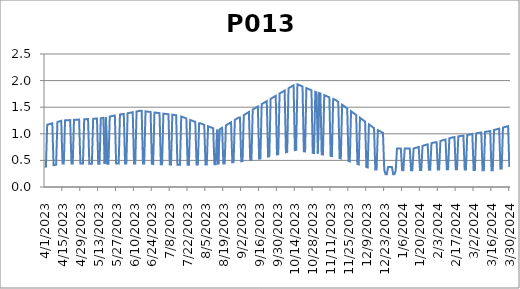
| Category | P013 |
|---|---|
| 4/1/23 | 0.38 |
| 4/2/23 | 0.384 |
| 4/3/23 | 1.17 |
| 4/4/23 | 1.177 |
| 4/5/23 | 1.184 |
| 4/6/23 | 1.19 |
| 4/7/23 | 1.197 |
| 4/8/23 | 0.411 |
| 4/9/23 | 0.415 |
| 4/10/23 | 0.42 |
| 4/11/23 | 1.223 |
| 4/12/23 | 1.23 |
| 4/13/23 | 1.236 |
| 4/14/23 | 1.243 |
| 4/15/23 | 0.442 |
| 4/16/23 | 0.442 |
| 4/17/23 | 1.252 |
| 4/18/23 | 1.254 |
| 4/19/23 | 1.255 |
| 4/20/23 | 1.257 |
| 4/21/23 | 1.258 |
| 4/22/23 | 0.441 |
| 4/23/23 | 0.441 |
| 4/24/23 | 1.262 |
| 4/25/23 | 1.264 |
| 4/26/23 | 1.265 |
| 4/27/23 | 1.266 |
| 4/28/23 | 1.268 |
| 4/29/23 | 0.44 |
| 4/30/23 | 0.44 |
| 5/1/23 | 0.439 |
| 5/2/23 | 1.273 |
| 5/3/23 | 1.275 |
| 5/4/23 | 1.276 |
| 5/5/23 | 1.277 |
| 5/6/23 | 0.439 |
| 5/7/23 | 0.439 |
| 5/8/23 | 0.438 |
| 5/9/23 | 1.283 |
| 5/10/23 | 1.284 |
| 5/11/23 | 1.286 |
| 5/12/23 | 1.287 |
| 5/13/23 | 0.438 |
| 5/14/23 | 0.437 |
| 5/15/23 | 1.291 |
| 5/16/23 | 1.296 |
| 5/17/23 | 1.301 |
| 5/18/23 | 0.438 |
| 5/19/23 | 1.31 |
| 5/20/23 | 0.438 |
| 5/21/23 | 0.438 |
| 5/22/23 | 1.325 |
| 5/23/23 | 1.329 |
| 5/24/23 | 1.334 |
| 5/25/23 | 1.339 |
| 5/26/23 | 1.344 |
| 5/27/23 | 0.44 |
| 5/28/23 | 0.44 |
| 5/29/23 | 0.44 |
| 5/30/23 | 1.363 |
| 5/31/23 | 1.367 |
| 6/1/23 | 1.367 |
| 6/2/23 | 1.372 |
| 6/3/23 | 0.441 |
| 6/4/23 | 0.441 |
| 6/5/23 | 1.386 |
| 6/6/23 | 1.391 |
| 6/7/23 | 1.396 |
| 6/8/23 | 1.401 |
| 6/9/23 | 1.405 |
| 6/10/23 | 0.442 |
| 6/11/23 | 0.442 |
| 6/12/23 | 1.419 |
| 6/13/23 | 1.424 |
| 6/14/23 | 1.429 |
| 6/15/23 | 1.434 |
| 6/16/23 | 1.431 |
| 6/17/23 | 0.441 |
| 6/18/23 | 0.44 |
| 6/19/23 | 1.422 |
| 6/20/23 | 1.419 |
| 6/21/23 | 1.416 |
| 6/22/23 | 1.413 |
| 6/23/23 | 1.41 |
| 6/24/23 | 0.435 |
| 6/25/23 | 0.434 |
| 6/26/23 | 1.401 |
| 6/27/23 | 1.398 |
| 6/28/23 | 1.395 |
| 6/29/23 | 1.392 |
| 6/30/23 | 1.389 |
| 7/1/23 | 0.429 |
| 7/2/23 | 0.428 |
| 7/3/23 | 1.38 |
| 7/4/23 | 1.376 |
| 7/5/23 | 1.373 |
| 7/6/23 | 1.37 |
| 7/7/23 | 1.367 |
| 7/8/23 | 0.423 |
| 7/9/23 | 0.422 |
| 7/10/23 | 1.358 |
| 7/11/23 | 1.355 |
| 7/12/23 | 1.352 |
| 7/13/23 | 1.349 |
| 7/14/23 | 0.417 |
| 7/15/23 | 0.416 |
| 7/16/23 | 0.417 |
| 7/17/23 | 1.325 |
| 7/18/23 | 1.316 |
| 7/19/23 | 1.307 |
| 7/20/23 | 1.297 |
| 7/21/23 | 1.288 |
| 7/22/23 | 0.419 |
| 7/23/23 | 0.419 |
| 7/24/23 | 1.261 |
| 7/25/23 | 1.252 |
| 7/26/23 | 1.242 |
| 7/27/23 | 1.233 |
| 7/28/23 | 1.224 |
| 7/29/23 | 0.422 |
| 7/30/23 | 0.422 |
| 7/31/23 | 1.196 |
| 8/1/23 | 1.196 |
| 8/2/23 | 1.187 |
| 8/3/23 | 1.178 |
| 8/4/23 | 1.169 |
| 8/5/23 | 0.424 |
| 8/6/23 | 0.424 |
| 8/7/23 | 1.141 |
| 8/8/23 | 1.132 |
| 8/9/23 | 1.123 |
| 8/10/23 | 1.114 |
| 8/11/23 | 1.105 |
| 8/12/23 | 0.427 |
| 8/13/23 | 0.427 |
| 8/14/23 | 1.077 |
| 8/15/23 | 0.428 |
| 8/16/23 | 1.083 |
| 8/17/23 | 1.098 |
| 8/18/23 | 1.112 |
| 8/19/23 | 0.441 |
| 8/20/23 | 0.444 |
| 8/21/23 | 1.157 |
| 8/22/23 | 1.172 |
| 8/23/23 | 1.187 |
| 8/24/23 | 1.202 |
| 8/25/23 | 1.217 |
| 8/26/23 | 0.464 |
| 8/27/23 | 0.467 |
| 8/28/23 | 1.261 |
| 8/29/23 | 1.276 |
| 8/30/23 | 1.291 |
| 8/31/23 | 1.306 |
| 9/1/23 | 1.306 |
| 9/2/23 | 0.483 |
| 9/3/23 | 0.487 |
| 9/4/23 | 1.351 |
| 9/5/23 | 1.366 |
| 9/6/23 | 1.381 |
| 9/7/23 | 1.395 |
| 9/8/23 | 1.41 |
| 9/9/23 | 0.506 |
| 9/10/23 | 0.51 |
| 9/11/23 | 1.455 |
| 9/12/23 | 1.47 |
| 9/13/23 | 1.485 |
| 9/14/23 | 1.5 |
| 9/15/23 | 1.515 |
| 9/16/23 | 0.532 |
| 9/17/23 | 0.538 |
| 9/18/23 | 1.557 |
| 9/19/23 | 1.571 |
| 9/20/23 | 1.586 |
| 9/21/23 | 1.6 |
| 9/22/23 | 1.614 |
| 9/23/23 | 0.572 |
| 9/24/23 | 0.578 |
| 9/25/23 | 1.657 |
| 9/26/23 | 1.671 |
| 9/27/23 | 1.685 |
| 9/28/23 | 1.699 |
| 9/29/23 | 1.714 |
| 9/30/23 | 0.612 |
| 10/1/23 | 0.618 |
| 10/2/23 | 1.756 |
| 10/3/23 | 1.77 |
| 10/4/23 | 1.785 |
| 10/5/23 | 1.799 |
| 10/6/23 | 1.813 |
| 10/7/23 | 0.652 |
| 10/8/23 | 0.658 |
| 10/9/23 | 1.856 |
| 10/10/23 | 1.87 |
| 10/11/23 | 1.884 |
| 10/12/23 | 1.898 |
| 10/13/23 | 1.912 |
| 10/14/23 | 0.693 |
| 10/15/23 | 0.698 |
| 10/16/23 | 1.931 |
| 10/17/23 | 1.92 |
| 10/18/23 | 1.91 |
| 10/19/23 | 1.9 |
| 10/20/23 | 1.89 |
| 10/21/23 | 0.672 |
| 10/22/23 | 0.668 |
| 10/23/23 | 1.859 |
| 10/24/23 | 1.849 |
| 10/25/23 | 1.839 |
| 10/26/23 | 1.829 |
| 10/27/23 | 1.819 |
| 10/28/23 | 0.641 |
| 10/29/23 | 0.637 |
| 10/30/23 | 1.788 |
| 10/31/23 | 1.778 |
| 11/1/23 | 0.628 |
| 11/2/23 | 1.768 |
| 11/3/23 | 1.757 |
| 11/4/23 | 0.615 |
| 11/5/23 | 0.61 |
| 11/6/23 | 1.727 |
| 11/7/23 | 1.717 |
| 11/8/23 | 1.706 |
| 11/9/23 | 1.696 |
| 11/10/23 | 1.686 |
| 11/11/23 | 0.584 |
| 11/12/23 | 0.58 |
| 11/13/23 | 1.656 |
| 11/14/23 | 1.645 |
| 11/15/23 | 1.635 |
| 11/16/23 | 1.618 |
| 11/17/23 | 1.6 |
| 11/18/23 | 0.543 |
| 11/19/23 | 0.535 |
| 11/20/23 | 1.547 |
| 11/21/23 | 1.53 |
| 11/22/23 | 1.512 |
| 11/23/23 | 1.494 |
| 11/24/23 | 1.477 |
| 11/25/23 | 0.487 |
| 11/26/23 | 0.479 |
| 11/27/23 | 1.424 |
| 11/28/23 | 1.406 |
| 11/29/23 | 1.389 |
| 11/30/23 | 1.371 |
| 12/1/23 | 1.353 |
| 12/2/23 | 0.431 |
| 12/3/23 | 0.423 |
| 12/4/23 | 1.301 |
| 12/5/23 | 1.283 |
| 12/6/23 | 1.265 |
| 12/7/23 | 1.248 |
| 12/8/23 | 1.23 |
| 12/9/23 | 0.375 |
| 12/10/23 | 0.367 |
| 12/11/23 | 1.177 |
| 12/12/23 | 1.16 |
| 12/13/23 | 1.142 |
| 12/14/23 | 1.125 |
| 12/15/23 | 1.107 |
| 12/16/23 | 0.327 |
| 12/17/23 | 0.327 |
| 12/18/23 | 1.069 |
| 12/19/23 | 1.056 |
| 12/20/23 | 1.043 |
| 12/21/23 | 1.03 |
| 12/22/23 | 1.018 |
| 12/23/23 | 0.324 |
| 12/24/23 | 0.24 |
| 12/25/23 | 0.24 |
| 12/26/23 | 0.374 |
| 12/27/23 | 0.374 |
| 12/28/23 | 0.374 |
| 12/29/23 | 0.374 |
| 12/30/23 | 0.24 |
| 12/31/23 | 0.24 |
| 1/1/24 | 0.315 |
| 1/2/24 | 0.724 |
| 1/3/24 | 0.724 |
| 1/4/24 | 0.724 |
| 1/5/24 | 0.724 |
| 1/6/24 | 0.315 |
| 1/7/24 | 0.315 |
| 1/8/24 | 0.724 |
| 1/9/24 | 0.724 |
| 1/10/24 | 0.724 |
| 1/11/24 | 0.724 |
| 1/12/24 | 0.724 |
| 1/13/24 | 0.315 |
| 1/14/24 | 0.315 |
| 1/15/24 | 0.724 |
| 1/16/24 | 0.731 |
| 1/17/24 | 0.738 |
| 1/18/24 | 0.745 |
| 1/19/24 | 0.753 |
| 1/20/24 | 0.318 |
| 1/21/24 | 0.319 |
| 1/22/24 | 0.774 |
| 1/23/24 | 0.781 |
| 1/24/24 | 0.788 |
| 1/25/24 | 0.795 |
| 1/26/24 | 0.802 |
| 1/27/24 | 0.323 |
| 1/28/24 | 0.324 |
| 1/29/24 | 0.823 |
| 1/30/24 | 0.83 |
| 1/31/24 | 0.837 |
| 2/1/24 | 0.837 |
| 2/2/24 | 0.844 |
| 2/3/24 | 0.328 |
| 2/4/24 | 0.328 |
| 2/5/24 | 0.865 |
| 2/6/24 | 0.872 |
| 2/7/24 | 0.879 |
| 2/8/24 | 0.886 |
| 2/9/24 | 0.894 |
| 2/10/24 | 0.333 |
| 2/11/24 | 0.334 |
| 2/12/24 | 0.915 |
| 2/13/24 | 0.922 |
| 2/14/24 | 0.929 |
| 2/15/24 | 0.936 |
| 2/16/24 | 0.94 |
| 2/17/24 | 0.335 |
| 2/18/24 | 0.334 |
| 2/19/24 | 0.951 |
| 2/20/24 | 0.955 |
| 2/21/24 | 0.959 |
| 2/22/24 | 0.963 |
| 2/23/24 | 0.967 |
| 2/24/24 | 0.328 |
| 2/25/24 | 0.327 |
| 2/26/24 | 0.978 |
| 2/27/24 | 0.982 |
| 2/28/24 | 0.986 |
| 2/29/24 | 0.99 |
| 3/1/24 | 0.998 |
| 3/2/24 | 0.321 |
| 3/3/24 | 0.32 |
| 3/4/24 | 1.009 |
| 3/5/24 | 1.013 |
| 3/6/24 | 1.017 |
| 3/7/24 | 1.021 |
| 3/8/24 | 1.025 |
| 3/9/24 | 0.314 |
| 3/10/24 | 0.313 |
| 3/11/24 | 1.036 |
| 3/12/24 | 1.04 |
| 3/13/24 | 1.044 |
| 3/14/24 | 1.048 |
| 3/15/24 | 1.052 |
| 3/16/24 | 0.313 |
| 3/17/24 | 0.317 |
| 3/18/24 | 1.071 |
| 3/19/24 | 1.078 |
| 3/20/24 | 1.085 |
| 3/21/24 | 1.091 |
| 3/22/24 | 1.098 |
| 3/23/24 | 0.344 |
| 3/24/24 | 0.348 |
| 3/25/24 | 1.118 |
| 3/26/24 | 1.124 |
| 3/27/24 | 1.131 |
| 3/28/24 | 1.137 |
| 3/29/24 | 1.144 |
| 3/30/24 | 0.375 |